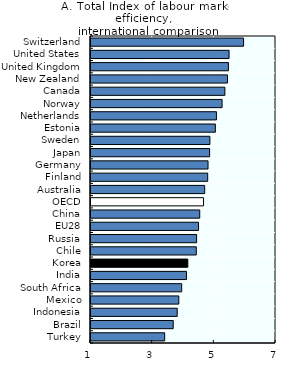
| Category | 2016-17 |
|---|---|
| Turkey | 3.389 |
| Brazil | 3.666 |
| Indonesia | 3.796 |
| Mexico | 3.848 |
| South Africa | 3.941 |
| India | 4.096 |
| Korea | 4.14 |
| Chile | 4.415 |
| Russia | 4.425 |
| EU28 | 4.488 |
| China | 4.527 |
| OECD | 4.651 |
| Australia | 4.687 |
| Finland | 4.785 |
| Germany | 4.796 |
| Japan | 4.847 |
| Sweden | 4.856 |
| Estonia | 5.034 |
| Netherlands | 5.068 |
| Norway | 5.252 |
| Canada | 5.342 |
| New Zealand | 5.426 |
| United Kingdom | 5.458 |
| United States | 5.478 |
| Switzerland | 5.949 |